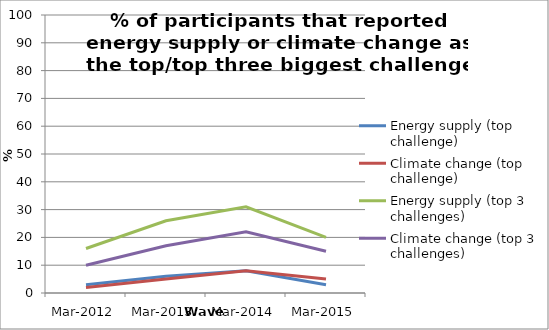
| Category | Energy supply (top challenge) | Climate change (top challenge) | Energy supply (top 3 challenges) | Climate change (top 3 challenges) |
|---|---|---|---|---|
| 2012-03-01 | 3 | 2 | 16 | 10 |
| 2013-03-01 | 6 | 5 | 26 | 17 |
| 2014-03-01 | 8 | 8 | 31 | 22 |
| 2015-03-01 | 3 | 5 | 20 | 15 |